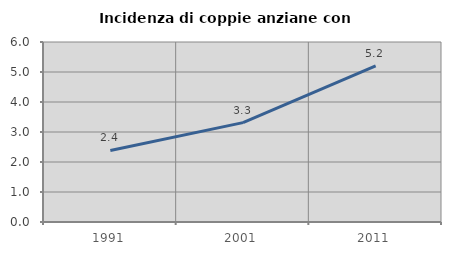
| Category | Incidenza di coppie anziane con figli |
|---|---|
| 1991.0 | 2.386 |
| 2001.0 | 3.312 |
| 2011.0 | 5.204 |